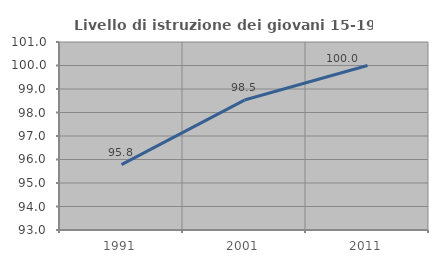
| Category | Livello di istruzione dei giovani 15-19 anni |
|---|---|
| 1991.0 | 95.783 |
| 2001.0 | 98.529 |
| 2011.0 | 100 |